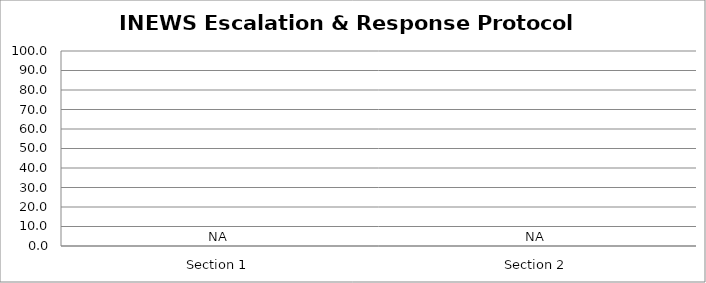
| Category | Series 0 |
|---|---|
| Section 1 | 0 |
| Section 2 | 0 |